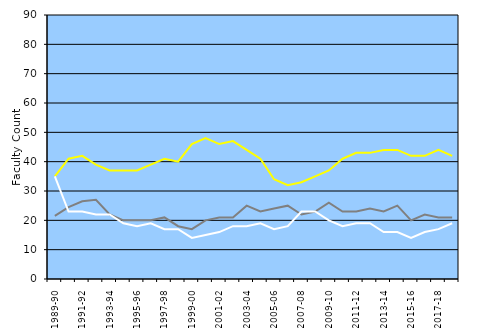
| Category | Simon School of Business | Warner Graduate School of Education | School of Nursing |
|---|---|---|---|
| 1989-90 | 35 | 21.5 | 35 |
| 1990-91 | 41 | 24.5 | 23 |
| 1991-92 | 42 | 26.5 | 23 |
| 1992-93 | 39 | 27 | 22 |
| 1993-94 | 37 | 22 | 22 |
| 1994-95 | 37 | 20 | 19 |
| 1995-96 | 37 | 20 | 18 |
| 1996-97 | 39 | 20 | 19 |
| 1997-98 | 41 | 21 | 17 |
| 1998-99 | 40 | 18 | 17 |
| 1999-00 | 46 | 17 | 14 |
| 2000-01 | 48 | 20 | 15 |
| 2001-02 | 46 | 21 | 16 |
| 2002-03 | 47 | 21 | 18 |
| 2003-04 | 44 | 25 | 18 |
| 2004-05 | 41 | 23 | 19 |
| 2005-06 | 34 | 24 | 17 |
| 2006-07 | 32 | 25 | 18 |
| 2007-08 | 33 | 22 | 23 |
| 2008-09 | 35 | 23 | 23 |
| 2009-10 | 37 | 26 | 20 |
| 2010-11 | 41 | 23 | 18 |
| 2011-12 | 43 | 23 | 19 |
| 2012-13 | 43 | 24 | 19 |
| 2013-14 | 44 | 23 | 16 |
| 2014-15 | 44 | 25 | 16 |
| 2015-16 | 42 | 20 | 14 |
| 2016-17 | 42 | 22 | 16 |
| 2017-18 | 44 | 21 | 17 |
| 2018-19 | 42 | 21 | 19 |